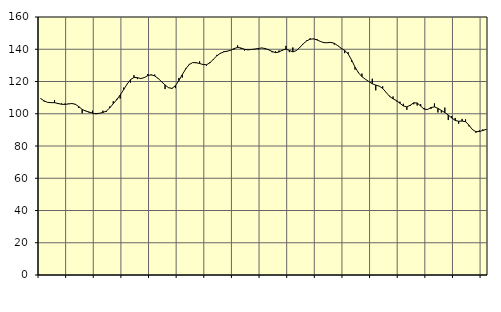
| Category | Piggar | Series 1 |
|---|---|---|
| nan | 109.6 | 109.36 |
| 87.0 | 107.6 | 107.99 |
| 87.0 | 107 | 107.05 |
| 87.0 | 107 | 106.88 |
| nan | 108.4 | 106.86 |
| 88.0 | 106 | 106.39 |
| 88.0 | 106.4 | 105.88 |
| 88.0 | 106.3 | 105.81 |
| nan | 106.3 | 106.06 |
| 89.0 | 106.6 | 106.34 |
| 89.0 | 105.6 | 105.93 |
| 89.0 | 103.6 | 104.45 |
| nan | 100.3 | 102.7 |
| 90.0 | 101.9 | 101.67 |
| 90.0 | 100.7 | 101.09 |
| 90.0 | 101.9 | 100.37 |
| nan | 99.7 | 100.04 |
| 91.0 | 100.2 | 100.3 |
| 91.0 | 101.9 | 100.79 |
| 91.0 | 101.2 | 101.69 |
| nan | 104.5 | 103.66 |
| 92.0 | 107.7 | 106.22 |
| 92.0 | 109.2 | 108.7 |
| 92.0 | 109.4 | 111.6 |
| nan | 116.2 | 114.93 |
| 93.0 | 118.5 | 118.37 |
| 93.0 | 119.3 | 121.13 |
| 93.0 | 123.9 | 122.52 |
| nan | 121.5 | 122.36 |
| 94.0 | 121.9 | 121.84 |
| 94.0 | 122.8 | 122.42 |
| 94.0 | 124.6 | 123.65 |
| nan | 123.9 | 124.18 |
| 95.0 | 124.3 | 123.46 |
| 95.0 | 122.1 | 121.9 |
| 95.0 | 120.1 | 119.84 |
| nan | 115.3 | 117.86 |
| 96.0 | 116.3 | 116.16 |
| 96.0 | 115.4 | 115.72 |
| 96.0 | 115.9 | 117.42 |
| nan | 122.2 | 120.57 |
| 97.0 | 122.5 | 124.3 |
| 97.0 | 128.2 | 127.85 |
| 97.0 | 130.9 | 130.55 |
| nan | 131.7 | 131.74 |
| 98.0 | 131.4 | 131.66 |
| 98.0 | 132.5 | 131.15 |
| 98.0 | 130.6 | 130.54 |
| nan | 129.8 | 130.38 |
| 99.0 | 132.1 | 131.62 |
| 99.0 | 133.5 | 133.83 |
| 99.0 | 136.5 | 135.92 |
| nan | 137.2 | 137.48 |
| 0.0 | 138.7 | 138.39 |
| 0.0 | 138.6 | 138.81 |
| 0.0 | 139.5 | 139.37 |
| nan | 139.8 | 140.42 |
| 1.0 | 142.4 | 141.12 |
| 1.0 | 140.2 | 140.77 |
| 1.0 | 139.2 | 139.95 |
| nan | 140 | 139.63 |
| 2.0 | 139.8 | 139.86 |
| 2.0 | 139.9 | 140.11 |
| 2.0 | 139.8 | 140.46 |
| nan | 140.9 | 140.78 |
| 3.0 | 140 | 140.46 |
| 3.0 | 140 | 139.64 |
| 3.0 | 138.1 | 138.61 |
| nan | 138.7 | 137.9 |
| 4.0 | 139.2 | 138.3 |
| 4.0 | 139.2 | 139.49 |
| 4.0 | 142.1 | 140.1 |
| nan | 138.2 | 139.23 |
| 5.0 | 141.1 | 138.39 |
| 5.0 | 139.3 | 139.11 |
| 5.0 | 141.3 | 141.09 |
| nan | 143.2 | 143.38 |
| 6.0 | 145.5 | 145.17 |
| 6.0 | 146.8 | 146.24 |
| 6.0 | 146.6 | 146.41 |
| nan | 146.3 | 145.78 |
| 7.0 | 144.6 | 144.82 |
| 7.0 | 143.9 | 144.08 |
| 7.0 | 144.2 | 144.05 |
| nan | 144 | 144.25 |
| 8.0 | 142.9 | 143.69 |
| 8.0 | 142 | 142.22 |
| 8.0 | 140.4 | 140.6 |
| nan | 137.6 | 139.29 |
| 9.0 | 138.2 | 137.16 |
| 9.0 | 132.3 | 133.35 |
| 9.0 | 127.4 | 128.92 |
| nan | 125.8 | 125.42 |
| 10.0 | 124.9 | 123.02 |
| 10.0 | 121.3 | 121.39 |
| 10.0 | 120 | 120 |
| nan | 121.7 | 118.62 |
| 11.0 | 114.5 | 117.77 |
| 11.0 | 117 | 117.14 |
| 11.0 | 117 | 115.72 |
| nan | 113.4 | 113.26 |
| 12.0 | 111.1 | 110.76 |
| 12.0 | 110.7 | 109.3 |
| 12.0 | 107.7 | 108.15 |
| nan | 107.5 | 106.51 |
| 13.0 | 106.2 | 104.83 |
| 13.0 | 102.4 | 104.25 |
| 13.0 | 104.8 | 105.29 |
| nan | 105.9 | 106.79 |
| 14.0 | 105.1 | 106.69 |
| 14.0 | 106 | 104.77 |
| 14.0 | 103.6 | 102.82 |
| nan | 102.5 | 102.63 |
| 15.0 | 103 | 103.87 |
| 15.0 | 106.4 | 104.25 |
| 15.0 | 100.8 | 103.36 |
| nan | 100.7 | 102.06 |
| 16.0 | 103.8 | 100.69 |
| 16.0 | 96.1 | 99.23 |
| 16.0 | 98.6 | 97.39 |
| nan | 97.4 | 95.85 |
| 17.0 | 93.8 | 95.34 |
| 17.0 | 96.8 | 95.45 |
| 17.0 | 96.5 | 95.08 |
| nan | 92.2 | 92.89 |
| 18.0 | 90 | 90.18 |
| 18.0 | 88.2 | 88.88 |
| 18.0 | 89.7 | 88.97 |
| nan | 90.3 | 89.63 |
| 19.0 | 90.1 | 90.33 |